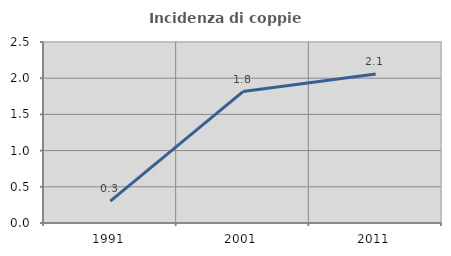
| Category | Incidenza di coppie miste |
|---|---|
| 1991.0 | 0.303 |
| 2001.0 | 1.816 |
| 2011.0 | 2.058 |